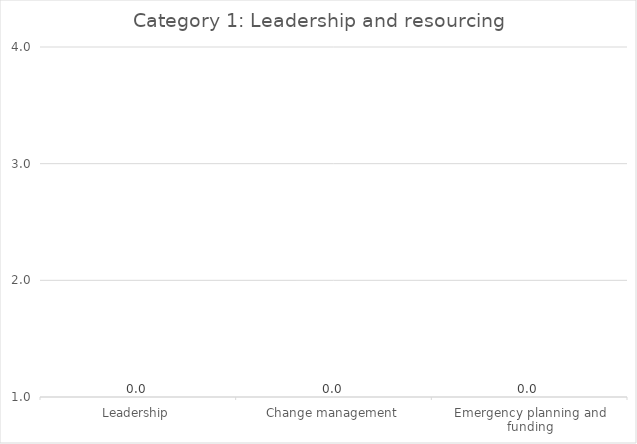
| Category |   Category 1: Leadership and resourcing |
|---|---|
| Leadership | 0 |
| Change management | 0 |
| Emergency planning and funding | 0 |